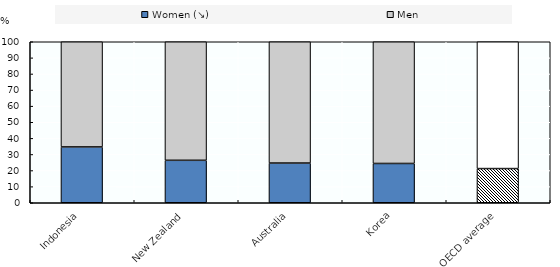
| Category | Women (↘) | Men |
|---|---|---|
| Indonesia | 34.671 | 65.329 |
| New Zealand | 26.371 | 73.629 |
| Australia | 24.666 | 75.334 |
| Korea | 24.406 | 75.594 |
| OECD average | 21.234 | 78.766 |